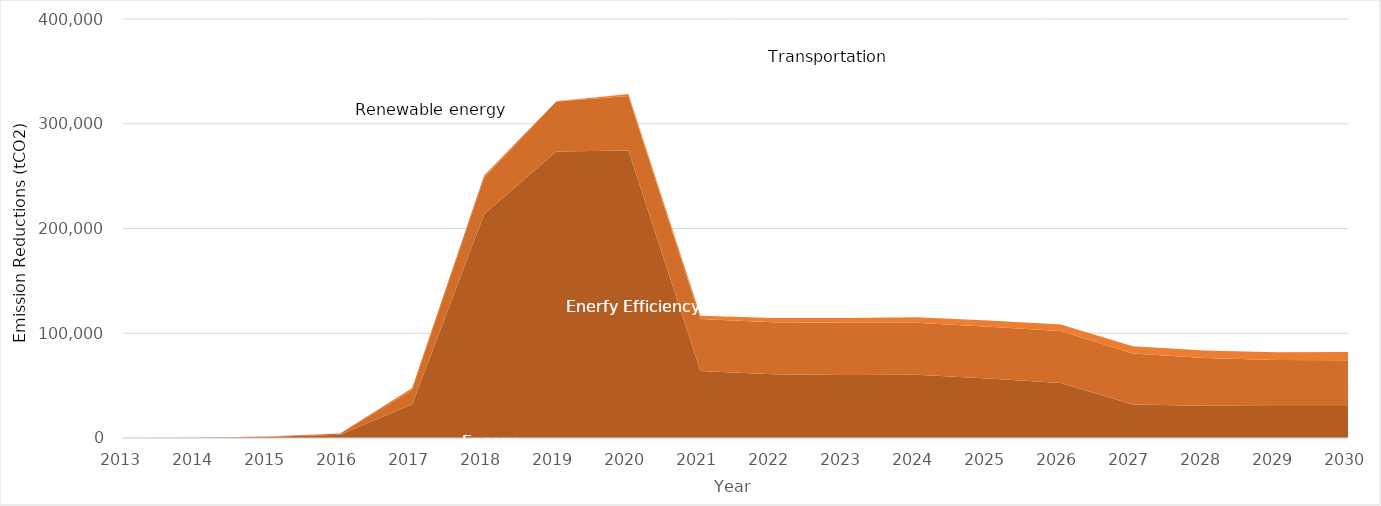
| Category | Energy efficiency | Renewable energy | Waste management & biomass utilisation | Transportation |
|---|---|---|---|---|
| 0 | 0 | 0 | 0 | 0 |
| 1 | 127 | 36 | 0 | 0 |
| 2 | 1239 | 259 | 0 | 134 |
| 3 | 3122 | 1158 | 0 | 324 |
| 4 | 32181 | 15283 | -1933 | 324 |
| 5 | 213806 | 36833 | -1853 | 324 |
| 6 | 273427 | 47750 | 262 | 324 |
| 7 | 274448 | 52025 | 1833 | 324 |
| 8 | 63950 | 49771 | 3030 | 0 |
| 9 | 60834 | 49669 | 3970 | 0 |
| 10 | 60260 | 49666 | 4728 | 0 |
| 11 | 60277 | 49663 | 5359 | 0 |
| 12 | 56714 | 49536 | 5897 | 0 |
| 13 | 52621 | 49432 | 6367 | 0 |
| 14 | 32050 | 48636 | 6785 | 0 |
| 15 | 30866 | 45425 | 7163 | 0 |
| 16 | 30431 | 43941 | 7509 | 0 |
| 17 | 30525 | 43803 | 7829 | 0 |